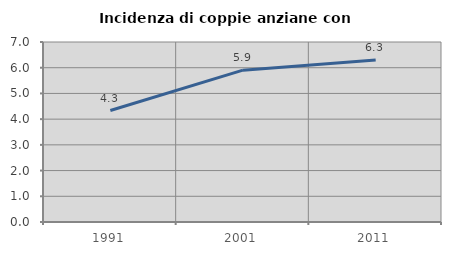
| Category | Incidenza di coppie anziane con figli |
|---|---|
| 1991.0 | 4.335 |
| 2001.0 | 5.906 |
| 2011.0 | 6.296 |